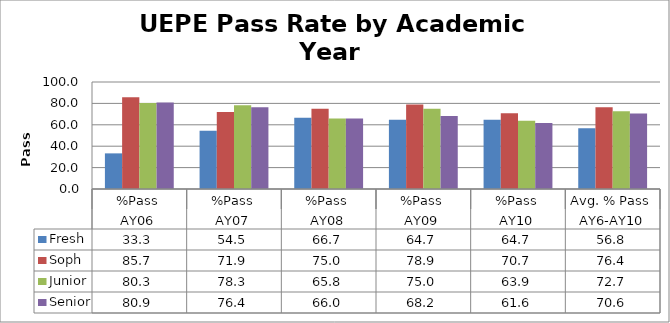
| Category | Fresh | Soph | Junior | Senior |
|---|---|---|---|---|
| 0 | 33.3 | 85.7 | 80.3 | 80.9 |
| 1 | 54.5 | 71.9 | 78.3 | 76.4 |
| 2 | 66.7 | 75 | 65.8 | 66 |
| 3 | 64.7 | 78.9 | 75 | 68.2 |
| 4 | 64.7 | 70.7 | 63.9 | 61.6 |
| 5 | 56.78 | 76.44 | 72.66 | 70.62 |